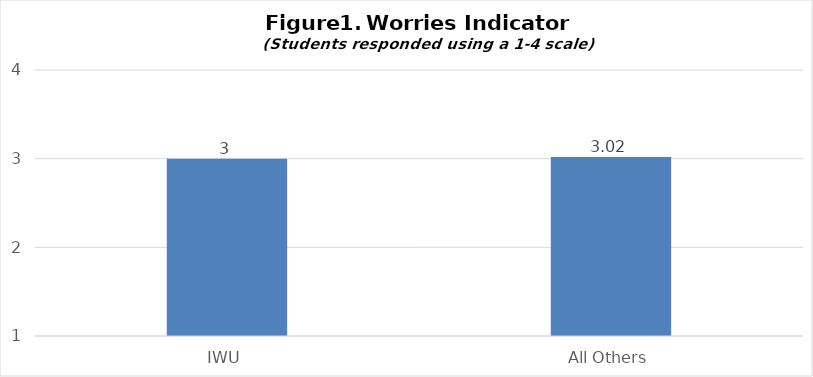
| Category | IWU |
|---|---|
| IWU | 3 |
| All Others | 3.02 |